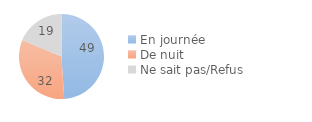
| Category | Series 0 |
|---|---|
| En journée | 48.98 |
| De nuit | 32.34 |
| Ne sait pas/Refus | 18.68 |